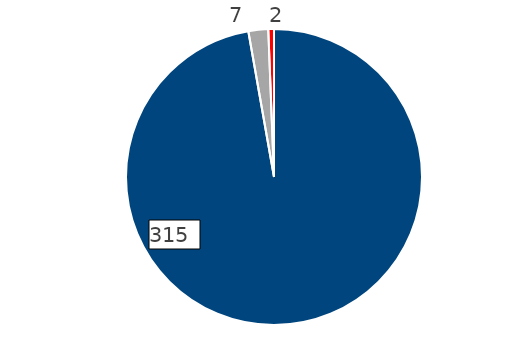
| Category | Series 0 |
|---|---|
| E-mail a Transparencia CORREOS | 315 |
| Portal Transparencia AGE | 7 |
| Registro general CORREOS | 2 |